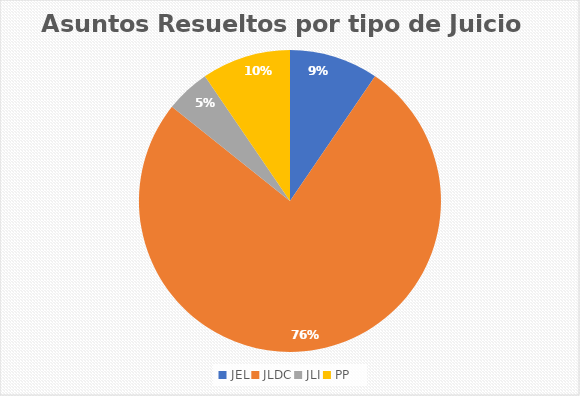
| Category | Rubro Cantidad |
|---|---|
| JEL | 2 |
| JLDC | 16 |
| JLI | 1 |
| PP | 2 |